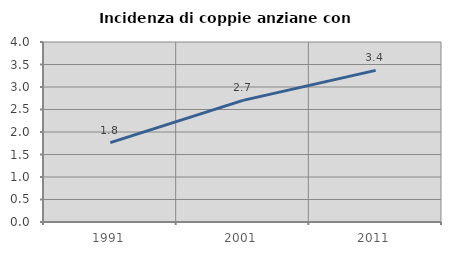
| Category | Incidenza di coppie anziane con figli |
|---|---|
| 1991.0 | 1.763 |
| 2001.0 | 2.703 |
| 2011.0 | 3.37 |